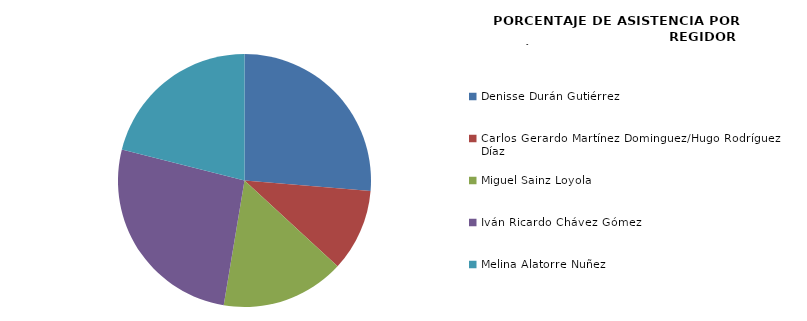
| Category | Series 0 |
|---|---|
| Denisse Durán Gutiérrez | 100 |
| Carlos Gerardo Martínez Dominguez/Hugo Rodríguez Díaz | 40 |
| Miguel Sainz Loyola | 60 |
| Iván Ricardo Chávez Gómez | 100 |
| Melina Alatorre Nuñez | 80 |